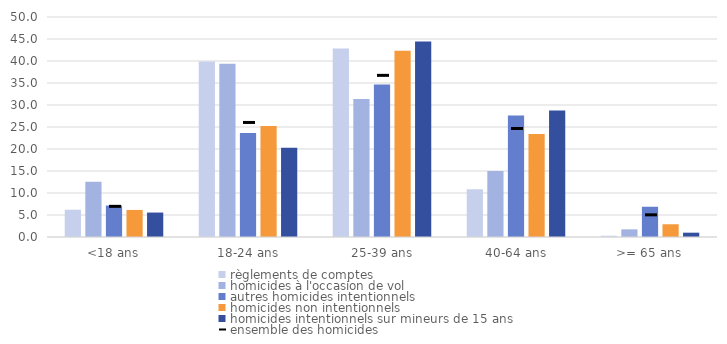
| Category | règlements de comptes | homicides à l'occasion de vol | autres homicides intentionnels | homicides non intentionnels | homicides intentionnels sur mineurs de 15 ans |
|---|---|---|---|---|---|
| <18 ans | 6.197 | 12.544 | 7.146 | 6.152 | 5.556 |
| 18-24 ans | 39.859 | 39.373 | 23.662 | 25.211 | 20.261 |
| 25-39 ans | 42.817 | 31.359 | 34.687 | 42.34 | 44.444 |
| 40-64 ans | 10.845 | 14.983 | 27.632 | 23.402 | 28.758 |
| >= 65 ans | 0.282 | 1.742 | 6.874 | 2.895 | 0.98 |